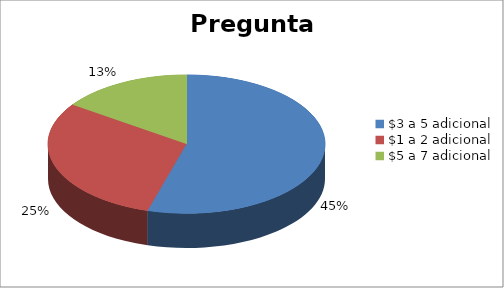
| Category | Series 0 |
|---|---|
| $3 a 5 adicional | 0.452 |
| $1 a 2 adicional | 0.25 |
| $5 a 7 adicional | 0.128 |